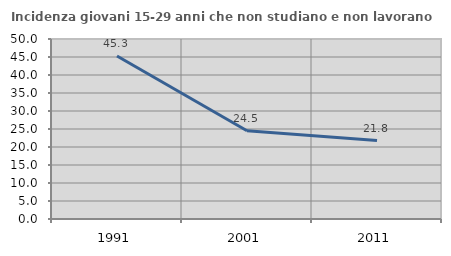
| Category | Incidenza giovani 15-29 anni che non studiano e non lavorano  |
|---|---|
| 1991.0 | 45.288 |
| 2001.0 | 24.506 |
| 2011.0 | 21.782 |